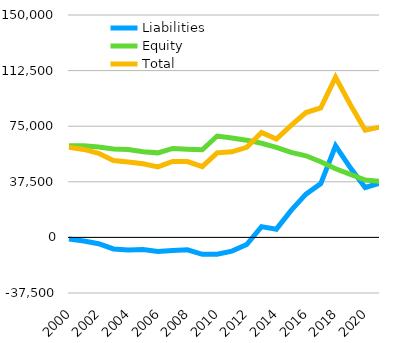
| Category | Liabilities  | Equity  | Total |
|---|---|---|---|
| 2000 | -1045 | 61788 | 60743 |
| 2001 | -2468 | 61788 | 59320 |
| 2002 | -4235 | 60910 | 56675 |
| 2003 | -7798 | 59656 | 51858 |
| 2004 | -8556 | 59341 | 50785 |
| 2005 | -8140 | 57773 | 49633 |
| 2006 | -9508 | 57023 | 47515 |
| 2007 | -8779 | 59975 | 51196 |
| 2008 | -8375 | 59490 | 51115 |
| 2009 | -11431 | 59124 | 47693 |
| 2010 | -11361 | 68372 | 57011 |
| 2011 | -9271 | 66977 | 57706 |
| 2012 | -4809 | 65582 | 60773 |
| 2013 | 7290 | 63468 | 70758 |
| 2014 | 5552 | 60752 | 66304 |
| 2015 | 18248 | 57306 | 75554 |
| 2016 | 29152 | 55039 | 84191 |
| 2017 | 36315 | 51070 | 87385 |
| 2018 | 61690 | 46304 | 107994 |
| 2019 | 46953 | 42550 | 89503 |
| 2020 | 33660 | 38704 | 72364 |
| 2021 | 36680.8 | 37755.9 | 74436.7 |